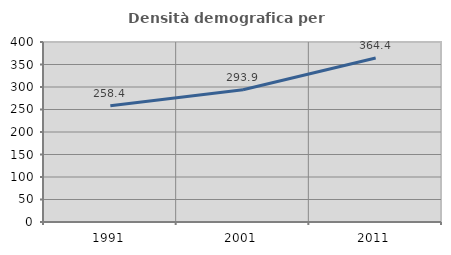
| Category | Densità demografica |
|---|---|
| 1991.0 | 258.384 |
| 2001.0 | 293.869 |
| 2011.0 | 364.417 |